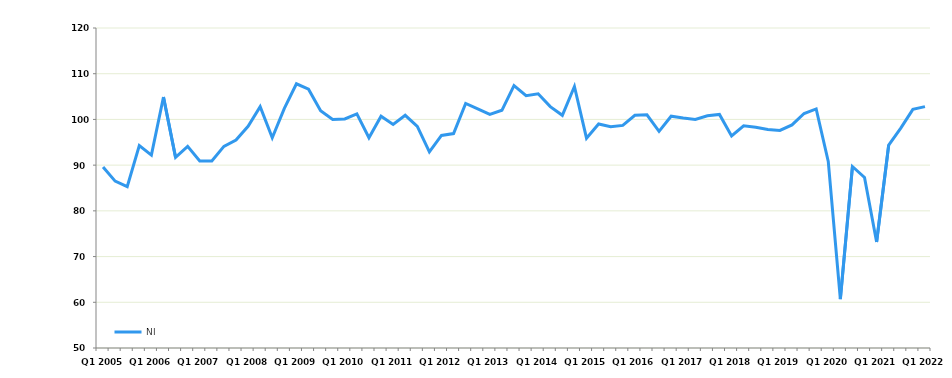
| Category | NI |
|---|---|
| Q1 2005 | 89.6 |
|  | 86.5 |
|  | 85.3 |
|  | 94.3 |
| Q1 2006 | 92.2 |
|  | 104.9 |
|  | 91.7 |
|  | 94.1 |
| Q1 2007 | 90.9 |
|  | 90.9 |
|  | 94.1 |
|  | 95.5 |
| Q1 2008 | 98.5 |
|  | 102.8 |
|  | 96 |
|  | 102.4 |
| Q1 2009 | 107.8 |
|  | 106.6 |
|  | 101.9 |
|  | 100 |
| Q1 2010 | 100.1 |
|  | 101.2 |
|  | 96 |
|  | 100.7 |
| Q1 2011 | 98.9 |
|  | 100.9 |
|  | 98.5 |
|  | 92.9 |
| Q1 2012 | 96.5 |
|  | 96.9 |
|  | 103.5 |
|  | 102.3 |
| Q1 2013 | 101.1 |
|  | 102 |
|  | 107.4 |
|  | 105.2 |
| Q1 2014 | 105.6 |
|  | 102.8 |
|  | 100.9 |
|  | 107.2 |
| Q1 2015 | 95.9 |
|  | 99 |
|  | 98.4 |
|  | 98.7 |
| Q1 2016 | 100.9 |
|  | 101 |
|  | 97.4 |
|  | 100.7 |
| Q1 2017 | 100.3 |
|  | 100 |
|  | 100.8 |
|  | 101.1 |
| Q1 2018 | 96.4 |
|  | 98.6 |
|  | 98.3 |
|  | 97.8 |
| Q1 2019 | 97.6 |
|  | 98.8 |
|  | 101.3 |
|  | 102.3 |
| Q1 2020 | 90.8 |
|  | 60.7 |
|  | 89.7 |
|  | 87.3 |
| Q1 2021 | 73.2 |
|  | 94.4 |
|  | 98.1 |
|  | 102.2 |
| Q1 2022 | 102.8 |